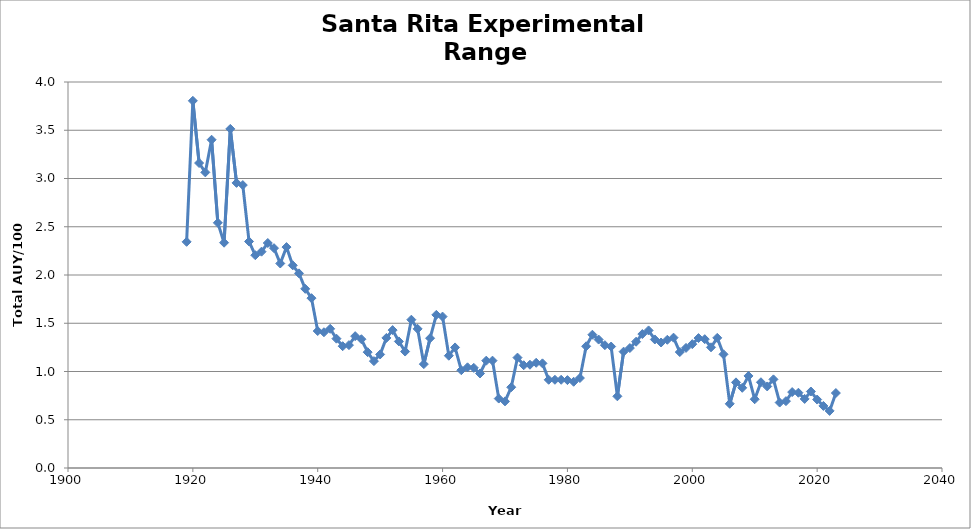
| Category | Series 0 |
|---|---|
| 1919.0 | 2.344 |
| 1920.0 | 3.805 |
| 1921.0 | 3.16 |
| 1922.0 | 3.064 |
| 1923.0 | 3.402 |
| 1924.0 | 2.541 |
| 1925.0 | 2.335 |
| 1926.0 | 3.514 |
| 1927.0 | 2.954 |
| 1928.0 | 2.932 |
| 1929.0 | 2.347 |
| 1930.0 | 2.205 |
| 1931.0 | 2.242 |
| 1932.0 | 2.331 |
| 1933.0 | 2.278 |
| 1934.0 | 2.119 |
| 1935.0 | 2.289 |
| 1936.0 | 2.1 |
| 1937.0 | 2.017 |
| 1938.0 | 1.857 |
| 1939.0 | 1.76 |
| 1940.0 | 1.419 |
| 1941.0 | 1.407 |
| 1942.0 | 1.442 |
| 1943.0 | 1.34 |
| 1944.0 | 1.262 |
| 1945.0 | 1.273 |
| 1946.0 | 1.366 |
| 1947.0 | 1.334 |
| 1948.0 | 1.2 |
| 1949.0 | 1.107 |
| 1950.0 | 1.177 |
| 1951.0 | 1.348 |
| 1952.0 | 1.429 |
| 1953.0 | 1.312 |
| 1954.0 | 1.207 |
| 1955.0 | 1.537 |
| 1956.0 | 1.442 |
| 1957.0 | 1.077 |
| 1958.0 | 1.345 |
| 1959.0 | 1.587 |
| 1960.0 | 1.569 |
| 1961.0 | 1.164 |
| 1962.0 | 1.249 |
| 1963.0 | 1.013 |
| 1964.0 | 1.044 |
| 1965.0 | 1.038 |
| 1966.0 | 0.979 |
| 1967.0 | 1.112 |
| 1968.0 | 1.113 |
| 1969.0 | 0.72 |
| 1970.0 | 0.69 |
| 1971.0 | 0.837 |
| 1972.0 | 1.144 |
| 1973.0 | 1.065 |
| 1974.0 | 1.07 |
| 1975.0 | 1.09 |
| 1976.0 | 1.084 |
| 1977.0 | 0.914 |
| 1978.0 | 0.914 |
| 1979.0 | 0.914 |
| 1980.0 | 0.911 |
| 1981.0 | 0.894 |
| 1982.0 | 0.932 |
| 1983.0 | 1.261 |
| 1984.0 | 1.381 |
| 1985.0 | 1.331 |
| 1986.0 | 1.273 |
| 1987.0 | 1.259 |
| 1988.0 | 0.743 |
| 1989.0 | 1.206 |
| 1990.0 | 1.243 |
| 1991.0 | 1.309 |
| 1992.0 | 1.388 |
| 1993.0 | 1.426 |
| 1994.0 | 1.332 |
| 1995.0 | 1.3 |
| 1996.0 | 1.329 |
| 1997.0 | 1.351 |
| 1998.0 | 1.201 |
| 1999.0 | 1.245 |
| 2000.0 | 1.283 |
| 2001.0 | 1.346 |
| 2002.0 | 1.335 |
| 2003.0 | 1.251 |
| 2004.0 | 1.348 |
| 2005.0 | 1.178 |
| 2006.0 | 0.665 |
| 2007.0 | 0.887 |
| 2008.0 | 0.831 |
| 2009.0 | 0.954 |
| 2010.0 | 0.713 |
| 2011.0 | 0.889 |
| 2012.0 | 0.845 |
| 2013.0 | 0.918 |
| 2014.0 | 0.678 |
| 2015.0 | 0.693 |
| 2016.0 | 0.787 |
| 2017.0 | 0.78 |
| 2018.0 | 0.716 |
| 2019.0 | 0.793 |
| 2020.0 | 0.709 |
| 2021.0 | 0.643 |
| 2022.0 | 0.592 |
| 2023.0 | 0.777 |